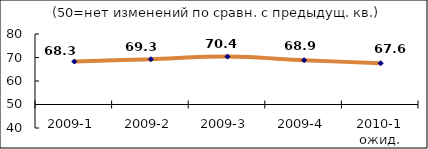
| Category | Диф.индекс ↓ |
|---|---|
| 2009-1 | 68.28 |
| 2009-2 | 69.275 |
| 2009-3 | 70.385 |
| 2009-4 | 68.85 |
| 2010-1 ожид. | 67.55 |